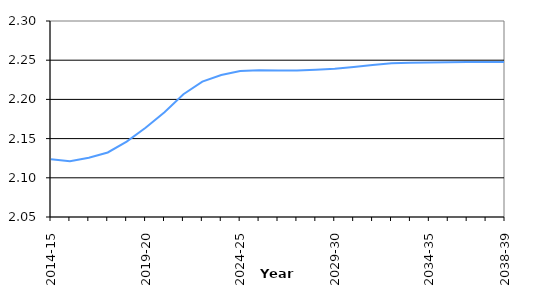
| Category | TFR |
|---|---|
| 2014-15 | 2.124 |
|  | 2.121 |
|  | 2.126 |
|  | 2.132 |
|  | 2.146 |
| 2019-20 | 2.164 |
|  | 2.184 |
|  | 2.207 |
|  | 2.223 |
|  | 2.231 |
| 2024-25 | 2.236 |
|  | 2.237 |
|  | 2.237 |
|  | 2.237 |
|  | 2.238 |
| 2029-30 | 2.239 |
|  | 2.241 |
|  | 2.244 |
|  | 2.246 |
|  | 2.247 |
| 2034-35 | 2.247 |
|  | 2.247 |
|  | 2.248 |
|  | 2.248 |
| 2038-39 | 2.248 |